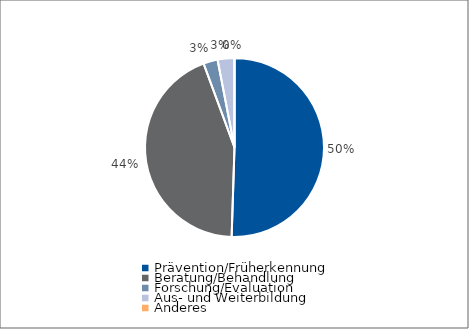
| Category | Series 0 |
|---|---|
| Prävention/Früherkennung | 78295 |
| Beratung/Behandlung | 68000 |
| Forschung/Evaluation | 4000 |
| Aus- und Weiterbildung | 4709 |
| Anderes | 0 |